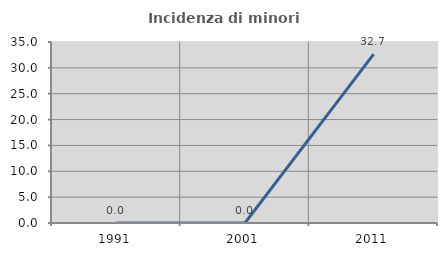
| Category | Incidenza di minori stranieri |
|---|---|
| 1991.0 | 0 |
| 2001.0 | 0 |
| 2011.0 | 32.653 |